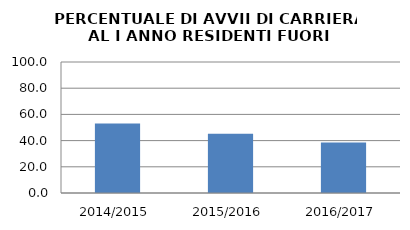
| Category | 2014/2015 2015/2016 2016/2017 |
|---|---|
| 2014/2015 | 53.125 |
| 2015/2016 | 45.161 |
| 2016/2017 | 38.462 |